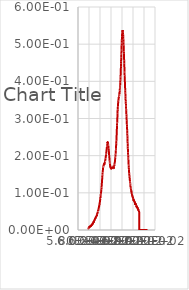
| Category | Series 0 |
|---|---|
| 598.5213013 | 0.005 |
| 598.6397705 | 0.004 |
| 598.7583008 | 0.005 |
| 598.87677 | 0.005 |
| 598.9953003 | 0.006 |
| 599.1138306 | 0.005 |
| 599.2322998 | 0.006 |
| 599.3508301 | 0.006 |
| 599.4693604 | 0.007 |
| 599.5878906 | 0.006 |
| 599.7064209 | 0.007 |
| 599.8248901 | 0.006 |
| 599.9434204 | 0.007 |
| 600.0619507 | 0.006 |
| 600.180481 | 0.007 |
| 600.2990112 | 0.007 |
| 600.4175415 | 0.007 |
| 600.5361328 | 0.007 |
| 600.6546631 | 0.008 |
| 600.7731934 | 0.007 |
| 600.8917236 | 0.008 |
| 601.0102539 | 0.008 |
| 601.1288452 | 0.009 |
| 601.2473755 | 0.007 |
| 601.3659058 | 0.009 |
| 601.4844971 | 0.009 |
| 601.6030273 | 0.01 |
| 601.7215576 | 0.008 |
| 601.8401489 | 0.01 |
| 601.9586792 | 0.009 |
| 602.0772705 | 0.01 |
| 602.1958008 | 0.009 |
| 602.3143921 | 0.01 |
| 602.4329834 | 0.01 |
| 602.5515137 | 0.008 |
| 602.670105 | 0.01 |
| 602.7886963 | 0.011 |
| 602.9072876 | 0.01 |
| 603.0258179 | 0.011 |
| 603.1444092 | 0.01 |
| 603.2630005 | 0.011 |
| 603.3815918 | 0.011 |
| 603.5001831 | 0.011 |
| 603.6187744 | 0.011 |
| 603.7373657 | 0.012 |
| 603.855957 | 0.012 |
| 603.9745483 | 0.012 |
| 604.0931396 | 0.012 |
| 604.211731 | 0.013 |
| 604.3303833 | 0.012 |
| 604.4489746 | 0.014 |
| 604.5675659 | 0.013 |
| 604.6861572 | 0.014 |
| 604.8048096 | 0.013 |
| 604.9234009 | 0.014 |
| 605.0419922 | 0.013 |
| 605.1606445 | 0.014 |
| 605.2792358 | 0.014 |
| 605.3978882 | 0.015 |
| 605.5164795 | 0.014 |
| 605.6351318 | 0.016 |
| 605.7537231 | 0.015 |
| 605.8723755 | 0.016 |
| 605.9910278 | 0.016 |
| 606.1096191 | 0.016 |
| 606.2282715 | 0.016 |
| 606.3469238 | 0.017 |
| 606.4655762 | 0.017 |
| 606.5841675 | 0.017 |
| 606.7028198 | 0.017 |
| 606.8214722 | 0.018 |
| 606.9401245 | 0.018 |
| 607.0587769 | 0.019 |
| 607.1774292 | 0.015 |
| 607.2960815 | 0.02 |
| 607.4147339 | 0.019 |
| 607.5333862 | 0.02 |
| 607.6520386 | 0.019 |
| 607.7706909 | 0.021 |
| 607.8893433 | 0.02 |
| 608.0080566 | 0.021 |
| 608.126709 | 0.021 |
| 608.2453613 | 0.022 |
| 608.3640137 | 0.022 |
| 608.4827271 | 0.022 |
| 608.6013794 | 0.022 |
| 608.7200317 | 0.022 |
| 608.8387451 | 0.021 |
| 608.9573975 | 0.022 |
| 609.0761108 | 0.021 |
| 609.1947632 | 0.023 |
| 609.3134766 | 0.025 |
| 609.4321289 | 0.025 |
| 609.5508423 | 0.026 |
| 609.6695557 | 0.026 |
| 609.788208 | 0.026 |
| 609.9069214 | 0.026 |
| 610.0256348 | 0.027 |
| 610.1443481 | 0.027 |
| 610.2630005 | 0.028 |
| 610.3817139 | 0.028 |
| 610.5004272 | 0.029 |
| 610.6191406 | 0.028 |
| 610.737854 | 0.029 |
| 610.8565674 | 0.029 |
| 610.9752808 | 0.03 |
| 611.0939941 | 0.03 |
| 611.2127075 | 0.031 |
| 611.3314209 | 0.03 |
| 611.4501343 | 0.032 |
| 611.5688477 | 0.032 |
| 611.687561 | 0.032 |
| 611.8063354 | 0.032 |
| 611.9250488 | 0.033 |
| 612.0437622 | 0.033 |
| 612.1624756 | 0.033 |
| 612.28125 | 0.033 |
| 612.3999634 | 0.035 |
| 612.5187378 | 0.035 |
| 612.6374512 | 0.035 |
| 612.7561646 | 0.035 |
| 612.874939 | 0.035 |
| 612.9936523 | 0.036 |
| 613.1124268 | 0.037 |
| 613.2312012 | 0.036 |
| 613.3499146 | 0.037 |
| 613.468689 | 0.037 |
| 613.5874023 | 0.038 |
| 613.7061768 | 0.038 |
| 613.8249512 | 0.038 |
| 613.9437256 | 0.039 |
| 614.062439 | 0.04 |
| 614.1812134 | 0.04 |
| 614.2999878 | 0.041 |
| 614.4187622 | 0.038 |
| 614.5375366 | 0.042 |
| 614.656311 | 0.042 |
| 614.7750854 | 0.043 |
| 614.8938599 | 0.042 |
| 615.0126343 | 0.044 |
| 615.1314087 | 0.044 |
| 615.2501831 | 0.045 |
| 615.3689575 | 0.045 |
| 615.4877319 | 0.047 |
| 615.6065063 | 0.046 |
| 615.7253418 | 0.047 |
| 615.8441162 | 0.047 |
| 615.9628906 | 0.049 |
| 616.081665 | 0.049 |
| 616.2005005 | 0.05 |
| 616.3192749 | 0.05 |
| 616.4380493 | 0.051 |
| 616.5568848 | 0.051 |
| 616.6756592 | 0.052 |
| 616.7944946 | 0.052 |
| 616.913269 | 0.055 |
| 617.0321045 | 0.054 |
| 617.1508789 | 0.056 |
| 617.2697144 | 0.056 |
| 617.3885498 | 0.057 |
| 617.5073242 | 0.058 |
| 617.6261597 | 0.059 |
| 617.7449951 | 0.059 |
| 617.8637695 | 0.061 |
| 617.982605 | 0.061 |
| 618.1014404 | 0.062 |
| 618.2202759 | 0.062 |
| 618.3391113 | 0.064 |
| 618.4579468 | 0.064 |
| 618.5767212 | 0.066 |
| 618.6955566 | 0.066 |
| 618.8143921 | 0.068 |
| 618.9332275 | 0.067 |
| 619.052063 | 0.069 |
| 619.1708984 | 0.07 |
| 619.2897339 | 0.071 |
| 619.4086304 | 0.072 |
| 619.5274658 | 0.073 |
| 619.6463013 | 0.074 |
| 619.7651367 | 0.075 |
| 619.8839722 | 0.076 |
| 620.0028687 | 0.079 |
| 620.1217041 | 0.079 |
| 620.2405396 | 0.081 |
| 620.359436 | 0.081 |
| 620.4782715 | 0.083 |
| 620.5971069 | 0.084 |
| 620.7160034 | 0.086 |
| 620.8348389 | 0.086 |
| 620.9537354 | 0.089 |
| 621.0725708 | 0.09 |
| 621.1914673 | 0.092 |
| 621.3103027 | 0.092 |
| 621.4291992 | 0.096 |
| 621.5480347 | 0.096 |
| 621.6669312 | 0.099 |
| 621.7858276 | 0.099 |
| 621.9047241 | 0.101 |
| 622.0235596 | 0.102 |
| 622.1424561 | 0.105 |
| 622.2613525 | 0.106 |
| 622.380249 | 0.108 |
| 622.4990845 | 0.11 |
| 622.617981 | 0.113 |
| 622.7368774 | 0.114 |
| 622.8557739 | 0.116 |
| 622.9746704 | 0.118 |
| 623.0935669 | 0.121 |
| 623.2124634 | 0.122 |
| 623.3313599 | 0.125 |
| 623.4502563 | 0.127 |
| 623.5691528 | 0.13 |
| 623.6880493 | 0.131 |
| 623.8070068 | 0.135 |
| 623.9259033 | 0.137 |
| 624.0447998 | 0.14 |
| 624.1636963 | 0.14 |
| 624.2825928 | 0.145 |
| 624.4015503 | 0.146 |
| 624.5204468 | 0.149 |
| 624.6393433 | 0.15 |
| 624.7583008 | 0.154 |
| 624.8771973 | 0.155 |
| 624.9960938 | 0.157 |
| 625.1150513 | 0.159 |
| 625.2339478 | 0.161 |
| 625.3529053 | 0.162 |
| 625.4718018 | 0.164 |
| 625.5907593 | 0.166 |
| 625.7097168 | 0.168 |
| 625.8286133 | 0.168 |
| 625.9475708 | 0.17 |
| 626.0664673 | 0.171 |
| 626.1854248 | 0.172 |
| 626.3043823 | 0.171 |
| 626.4233398 | 0.173 |
| 626.5422363 | 0.173 |
| 626.6611938 | 0.175 |
| 626.7801514 | 0.175 |
| 626.8991089 | 0.176 |
| 627.0180664 | 0.176 |
| 627.1370239 | 0.177 |
| 627.2559204 | 0.177 |
| 627.3748779 | 0.178 |
| 627.4938354 | 0.177 |
| 627.612793 | 0.179 |
| 627.7317505 | 0.175 |
| 627.850708 | 0.179 |
| 627.9697266 | 0.178 |
| 628.0886841 | 0.179 |
| 628.2076416 | 0.179 |
| 628.3265991 | 0.18 |
| 628.4455566 | 0.18 |
| 628.5645142 | 0.181 |
| 628.6835327 | 0.181 |
| 628.8024902 | 0.182 |
| 628.9214478 | 0.182 |
| 629.0404053 | 0.183 |
| 629.1594238 | 0.184 |
| 629.2783813 | 0.185 |
| 629.3973389 | 0.185 |
| 629.5163574 | 0.187 |
| 629.6353149 | 0.187 |
| 629.7543335 | 0.189 |
| 629.873291 | 0.19 |
| 629.9923096 | 0.192 |
| 630.1112671 | 0.192 |
| 630.2302856 | 0.194 |
| 630.3492432 | 0.196 |
| 630.4682617 | 0.197 |
| 630.5872803 | 0.198 |
| 630.7062378 | 0.2 |
| 630.8252563 | 0.199 |
| 630.9442749 | 0.203 |
| 631.0632324 | 0.203 |
| 631.182251 | 0.205 |
| 631.3012695 | 0.206 |
| 631.4202881 | 0.208 |
| 631.5393066 | 0.21 |
| 631.6583252 | 0.212 |
| 631.7772827 | 0.213 |
| 631.8963013 | 0.214 |
| 632.0153198 | 0.216 |
| 632.1343384 | 0.217 |
| 632.2533569 | 0.219 |
| 632.3723755 | 0.221 |
| 632.491394 | 0.222 |
| 632.6104126 | 0.225 |
| 632.7294312 | 0.225 |
| 632.8485107 | 0.227 |
| 632.9675293 | 0.229 |
| 633.0865479 | 0.232 |
| 633.2055664 | 0.234 |
| 633.324585 | 0.235 |
| 633.4436035 | 0.235 |
| 633.5626831 | 0.237 |
| 633.6817017 | 0.235 |
| 633.8007202 | 0.236 |
| 633.9197998 | 0.236 |
| 634.0388184 | 0.237 |
| 634.1578369 | 0.235 |
| 634.2769165 | 0.237 |
| 634.3959351 | 0.235 |
| 634.5150146 | 0.235 |
| 634.6340332 | 0.233 |
| 634.7531128 | 0.233 |
| 634.8721313 | 0.23 |
| 634.9912109 | 0.23 |
| 635.1102295 | 0.227 |
| 635.2293091 | 0.226 |
| 635.3483276 | 0.224 |
| 635.4674072 | 0.223 |
| 635.5864868 | 0.22 |
| 635.7055054 | 0.218 |
| 635.824585 | 0.215 |
| 635.9436646 | 0.214 |
| 636.0627441 | 0.212 |
| 636.1817627 | 0.21 |
| 636.3008423 | 0.208 |
| 636.4199219 | 0.205 |
| 636.5390015 | 0.202 |
| 636.6580811 | 0.201 |
| 636.7771606 | 0.199 |
| 636.8961792 | 0.196 |
| 637.0152588 | 0.195 |
| 637.1343384 | 0.193 |
| 637.253418 | 0.19 |
| 637.3724976 | 0.189 |
| 637.4915771 | 0.186 |
| 637.6106567 | 0.185 |
| 637.7297974 | 0.182 |
| 637.848877 | 0.181 |
| 637.9679565 | 0.179 |
| 638.0870361 | 0.178 |
| 638.2061157 | 0.176 |
| 638.3251953 | 0.175 |
| 638.4442749 | 0.173 |
| 638.5634155 | 0.172 |
| 638.6824951 | 0.171 |
| 638.8015747 | 0.172 |
| 638.9207153 | 0.17 |
| 639.0397949 | 0.169 |
| 639.1588745 | 0.167 |
| 639.2780151 | 0.168 |
| 639.3970947 | 0.166 |
| 639.5161743 | 0.166 |
| 639.6353149 | 0.167 |
| 639.7543945 | 0.167 |
| 639.8735352 | 0.168 |
| 639.9926147 | 0.167 |
| 640.1117554 | 0.168 |
| 640.230835 | 0.166 |
| 640.3499756 | 0.165 |
| 640.4691162 | 0.165 |
| 640.5881958 | 0.166 |
| 640.7073364 | 0.165 |
| 640.8264771 | 0.166 |
| 640.9455566 | 0.165 |
| 641.0646973 | 0.166 |
| 641.1838379 | 0.166 |
| 641.3029175 | 0.167 |
| 641.4220581 | 0.168 |
| 641.5411987 | 0.169 |
| 641.6603394 | 0.168 |
| 641.77948 | 0.169 |
| 641.8985596 | 0.168 |
| 642.0177002 | 0.169 |
| 642.1368408 | 0.169 |
| 642.2559814 | 0.169 |
| 642.3751221 | 0.17 |
| 642.4942627 | 0.17 |
| 642.6134033 | 0.17 |
| 642.7325439 | 0.17 |
| 642.8516846 | 0.169 |
| 642.9708252 | 0.17 |
| 643.0899658 | 0.17 |
| 643.2091064 | 0.17 |
| 643.3282471 | 0.169 |
| 643.4474487 | 0.17 |
| 643.5665894 | 0.169 |
| 643.68573 | 0.169 |
| 643.8048706 | 0.168 |
| 643.9240112 | 0.168 |
| 644.0432129 | 0.168 |
| 644.1623535 | 0.17 |
| 644.2814941 | 0.169 |
| 644.4006348 | 0.169 |
| 644.5198364 | 0.167 |
| 644.6389771 | 0.167 |
| 644.7581177 | 0.166 |
| 644.8773193 | 0.166 |
| 644.99646 | 0.165 |
| 645.1156616 | 0.167 |
| 645.2348022 | 0.167 |
| 645.3540039 | 0.17 |
| 645.4731445 | 0.171 |
| 645.5923462 | 0.173 |
| 645.7114868 | 0.172 |
| 645.8306885 | 0.174 |
| 645.9498291 | 0.173 |
| 646.0690308 | 0.175 |
| 646.1881714 | 0.175 |
| 646.307373 | 0.176 |
| 646.4265747 | 0.176 |
| 646.5457153 | 0.179 |
| 646.664917 | 0.179 |
| 646.7841187 | 0.181 |
| 646.9033203 | 0.182 |
| 647.0224609 | 0.183 |
| 647.1416626 | 0.185 |
| 647.2608643 | 0.188 |
| 647.3800659 | 0.189 |
| 647.4992065 | 0.191 |
| 647.6184082 | 0.192 |
| 647.7376099 | 0.194 |
| 647.8568115 | 0.195 |
| 647.9760132 | 0.199 |
| 648.0952148 | 0.199 |
| 648.2144165 | 0.202 |
| 648.3336182 | 0.203 |
| 648.4528198 | 0.206 |
| 648.5720215 | 0.209 |
| 648.6912231 | 0.212 |
| 648.8104248 | 0.214 |
| 648.9296265 | 0.217 |
| 649.0488281 | 0.219 |
| 649.1680298 | 0.223 |
| 649.2872314 | 0.226 |
| 649.4064331 | 0.23 |
| 649.5256958 | 0.232 |
| 649.6448975 | 0.237 |
| 649.7640991 | 0.24 |
| 649.8833008 | 0.243 |
| 650.0025024 | 0.247 |
| 650.1217651 | 0.252 |
| 650.2409668 | 0.255 |
| 650.3601685 | 0.261 |
| 650.4794312 | 0.264 |
| 650.5986328 | 0.269 |
| 650.7178345 | 0.273 |
| 650.8370972 | 0.278 |
| 650.9562988 | 0.281 |
| 651.0755615 | 0.286 |
| 651.1947632 | 0.289 |
| 651.3139648 | 0.294 |
| 651.4332275 | 0.298 |
| 651.5524292 | 0.302 |
| 651.6716919 | 0.305 |
| 651.7908936 | 0.31 |
| 651.9101563 | 0.313 |
| 652.0293579 | 0.321 |
| 652.1486206 | 0.321 |
| 652.2678833 | 0.324 |
| 652.387085 | 0.327 |
| 652.5063477 | 0.332 |
| 652.6256104 | 0.333 |
| 652.744812 | 0.337 |
| 652.8640747 | 0.339 |
| 652.9833374 | 0.341 |
| 653.1025391 | 0.344 |
| 653.2218018 | 0.347 |
| 653.3410645 | 0.346 |
| 653.4603271 | 0.349 |
| 653.5795288 | 0.351 |
| 653.6987915 | 0.352 |
| 653.8180542 | 0.353 |
| 653.9373169 | 0.354 |
| 654.0565796 | 0.355 |
| 654.1758423 | 0.357 |
| 654.295105 | 0.356 |
| 654.4143677 | 0.358 |
| 654.5335693 | 0.358 |
| 654.652832 | 0.36 |
| 654.7720947 | 0.36 |
| 654.8913574 | 0.362 |
| 655.0106201 | 0.364 |
| 655.1298828 | 0.365 |
| 655.2492065 | 0.365 |
| 655.3684692 | 0.369 |
| 655.4877319 | 0.368 |
| 655.6069946 | 0.371 |
| 655.7262573 | 0.371 |
| 655.84552 | 0.375 |
| 655.9647827 | 0.375 |
| 656.0840454 | 0.379 |
| 656.2033691 | 0.38 |
| 656.3226318 | 0.384 |
| 656.4418945 | 0.385 |
| 656.5611572 | 0.389 |
| 656.6804199 | 0.392 |
| 656.7997437 | 0.395 |
| 656.9190063 | 0.397 |
| 657.038269 | 0.402 |
| 657.1575928 | 0.404 |
| 657.2768555 | 0.41 |
| 657.3961182 | 0.413 |
| 657.5154419 | 0.418 |
| 657.6347046 | 0.422 |
| 657.7539673 | 0.427 |
| 657.873291 | 0.432 |
| 657.9925537 | 0.437 |
| 658.1118774 | 0.441 |
| 658.2311401 | 0.448 |
| 658.3504639 | 0.453 |
| 658.4697266 | 0.46 |
| 658.5890503 | 0.464 |
| 658.708313 | 0.472 |
| 658.8276367 | 0.475 |
| 658.9468994 | 0.482 |
| 659.0662231 | 0.486 |
| 659.1855469 | 0.492 |
| 659.3048096 | 0.496 |
| 659.4241333 | 0.502 |
| 659.543457 | 0.504 |
| 659.6627197 | 0.511 |
| 659.7820435 | 0.513 |
| 659.9013672 | 0.519 |
| 660.0206299 | 0.521 |
| 660.1399536 | 0.525 |
| 660.2592773 | 0.527 |
| 660.3786011 | 0.531 |
| 660.4978638 | 0.533 |
| 660.6171875 | 0.535 |
| 660.7365112 | 0.535 |
| 660.855835 | 0.537 |
| 660.9751587 | 0.536 |
| 661.0944214 | 0.538 |
| 661.2137451 | 0.536 |
| 661.3330688 | 0.537 |
| 661.4523926 | 0.535 |
| 661.5717163 | 0.535 |
| 661.69104 | 0.532 |
| 661.8103638 | 0.532 |
| 661.9296875 | 0.527 |
| 662.0490112 | 0.526 |
| 662.168335 | 0.521 |
| 662.2876587 | 0.519 |
| 662.4069824 | 0.514 |
| 662.5263062 | 0.513 |
| 662.6456299 | 0.508 |
| 662.7649536 | 0.505 |
| 662.8842773 | 0.5 |
| 663.0036011 | 0.496 |
| 663.1229248 | 0.49 |
| 663.2423096 | 0.487 |
| 663.3616333 | 0.48 |
| 663.480957 | 0.476 |
| 663.6002808 | 0.471 |
| 663.7196045 | 0.466 |
| 663.8389282 | 0.46 |
| 663.958313 | 0.456 |
| 664.0776367 | 0.448 |
| 664.1969604 | 0.444 |
| 664.3162842 | 0.439 |
| 664.4356689 | 0.434 |
| 664.5549927 | 0.427 |
| 664.6743164 | 0.423 |
| 664.7937012 | 0.416 |
| 664.9130249 | 0.412 |
| 665.0323486 | 0.408 |
| 665.1517334 | 0.403 |
| 665.2710571 | 0.397 |
| 665.3903809 | 0.392 |
| 665.5097656 | 0.388 |
| 665.6290894 | 0.384 |
| 665.7484741 | 0.379 |
| 665.8677979 | 0.376 |
| 665.9871826 | 0.371 |
| 666.1065063 | 0.368 |
| 666.2258911 | 0.363 |
| 666.3452148 | 0.36 |
| 666.4645996 | 0.353 |
| 666.5839233 | 0.35 |
| 666.7033081 | 0.346 |
| 666.8226318 | 0.346 |
| 666.9420166 | 0.341 |
| 667.0614014 | 0.339 |
| 667.1807251 | 0.335 |
| 667.3001099 | 0.332 |
| 667.4194336 | 0.326 |
| 667.5388184 | 0.325 |
| 667.6582031 | 0.321 |
| 667.7775269 | 0.318 |
| 667.8969116 | 0.314 |
| 668.0162964 | 0.311 |
| 668.1356812 | 0.305 |
| 668.2550049 | 0.304 |
| 668.3743896 | 0.299 |
| 668.4937744 | 0.296 |
| 668.6131592 | 0.292 |
| 668.7324829 | 0.289 |
| 668.8518677 | 0.284 |
| 668.9712524 | 0.283 |
| 669.0906372 | 0.278 |
| 669.210022 | 0.275 |
| 669.3293457 | 0.271 |
| 669.4487305 | 0.267 |
| 669.5681152 | 0.261 |
| 669.6875 | 0.259 |
| 669.8068848 | 0.253 |
| 669.9262695 | 0.251 |
| 670.0456543 | 0.245 |
| 670.1650391 | 0.238 |
| 670.2844238 | 0.232 |
| 670.4038086 | 0.228 |
| 670.5231934 | 0.225 |
| 670.6425781 | 0.219 |
| 670.7619629 | 0.215 |
| 670.8813477 | 0.211 |
| 671.0007324 | 0.208 |
| 671.1201172 | 0.203 |
| 671.239502 | 0.2 |
| 671.3588867 | 0.195 |
| 671.4782715 | 0.193 |
| 671.5976563 | 0.189 |
| 671.717041 | 0.187 |
| 671.8364258 | 0.183 |
| 671.9558105 | 0.18 |
| 672.0752563 | 0.175 |
| 672.1946411 | 0.174 |
| 672.3140259 | 0.169 |
| 672.4334106 | 0.168 |
| 672.5527954 | 0.163 |
| 672.6721802 | 0.161 |
| 672.791626 | 0.158 |
| 672.9110107 | 0.156 |
| 673.0303955 | 0.153 |
| 673.1497803 | 0.152 |
| 673.2692261 | 0.146 |
| 673.3886108 | 0.147 |
| 673.5079956 | 0.145 |
| 673.6274414 | 0.143 |
| 673.7468262 | 0.141 |
| 673.8662109 | 0.14 |
| 673.9856567 | 0.137 |
| 674.1050415 | 0.136 |
| 674.2244263 | 0.134 |
| 674.3438721 | 0.133 |
| 674.4632568 | 0.131 |
| 674.5826416 | 0.131 |
| 674.7020874 | 0.127 |
| 674.8214722 | 0.127 |
| 674.940918 | 0.125 |
| 675.0603027 | 0.125 |
| 675.1796875 | 0.122 |
| 675.2991333 | 0.121 |
| 675.4185181 | 0.119 |
| 675.5379639 | 0.119 |
| 675.6573486 | 0.116 |
| 675.7767944 | 0.116 |
| 675.8961792 | 0.113 |
| 676.015625 | 0.113 |
| 676.1350098 | 0.111 |
| 676.2544556 | 0.111 |
| 676.3739014 | 0.108 |
| 676.4932861 | 0.109 |
| 676.6127319 | 0.106 |
| 676.7321167 | 0.107 |
| 676.8515625 | 0.105 |
| 676.9710083 | 0.106 |
| 677.0903931 | 0.102 |
| 677.2098389 | 0.103 |
| 677.3292236 | 0.1 |
| 677.4486694 | 0.101 |
| 677.5681152 | 0.1 |
| 677.6875 | 0.1 |
| 677.8069458 | 0.098 |
| 677.9263916 | 0.098 |
| 678.0458374 | 0.096 |
| 678.1652222 | 0.096 |
| 678.284668 | 0.094 |
| 678.4041138 | 0.095 |
| 678.5235596 | 0.093 |
| 678.6429443 | 0.094 |
| 678.7623901 | 0.092 |
| 678.8818359 | 0.092 |
| 679.0012817 | 0.091 |
| 679.1206665 | 0.091 |
| 679.2401123 | 0.089 |
| 679.3595581 | 0.089 |
| 679.4790039 | 0.089 |
| 679.5984497 | 0.088 |
| 679.7178955 | 0.087 |
| 679.8372803 | 0.088 |
| 679.9567261 | 0.085 |
| 680.0761719 | 0.086 |
| 680.1956177 | 0.085 |
| 680.3150635 | 0.085 |
| 680.4345093 | 0.084 |
| 680.5539551 | 0.085 |
| 680.6734009 | 0.083 |
| 680.7928467 | 0.083 |
| 680.9122925 | 0.081 |
| 681.0317383 | 0.082 |
| 681.1511841 | 0.079 |
| 681.2706299 | 0.082 |
| 681.3900757 | 0.079 |
| 681.5095215 | 0.081 |
| 681.6289673 | 0.079 |
| 681.7484131 | 0.08 |
| 681.8678589 | 0.078 |
| 681.9873047 | 0.079 |
| 682.1067505 | 0.077 |
| 682.2261963 | 0.078 |
| 682.3456421 | 0.077 |
| 682.4650879 | 0.078 |
| 682.5845337 | 0.076 |
| 682.7039795 | 0.077 |
| 682.8234253 | 0.076 |
| 682.9428711 | 0.076 |
| 683.0623169 | 0.075 |
| 683.1817627 | 0.075 |
| 683.3012695 | 0.073 |
| 683.4207153 | 0.075 |
| 683.5401611 | 0.072 |
| 683.6596069 | 0.073 |
| 683.7790527 | 0.071 |
| 683.8984985 | 0.072 |
| 684.0180054 | 0.071 |
| 684.1374512 | 0.072 |
| 684.256897 | 0.067 |
| 684.3763428 | 0.071 |
| 684.4957886 | 0.069 |
| 684.6152954 | 0.07 |
| 684.7347412 | 0.068 |
| 684.854187 | 0.069 |
| 684.9736328 | 0.068 |
| 685.0931396 | 0.069 |
| 685.2125854 | 0.068 |
| 685.3320313 | 0.068 |
| 685.4514771 | 0.067 |
| 685.5709839 | 0.067 |
| 685.6904297 | 0.066 |
| 685.8098755 | 0.067 |
| 685.9293823 | 0.066 |
| 686.0488281 | 0.066 |
| 686.1682739 | 0.064 |
| 686.2877808 | 0.066 |
| 686.4072266 | 0.063 |
| 686.5266724 | 0.065 |
| 686.6461792 | 0.062 |
| 686.765625 | 0.064 |
| 686.8851318 | 0.06 |
| 687.0045776 | 0.063 |
| 687.1240234 | 0.061 |
| 687.2435303 | 0.063 |
| 687.3629761 | 0.061 |
| 687.4824829 | 0.062 |
| 687.6019287 | 0.06 |
| 687.7213745 | 0.061 |
| 687.8408813 | 0.059 |
| 687.9603271 | 0.06 |
| 688.079834 | 0.059 |
| 688.1992798 | 0.059 |
| 688.3187866 | 0.058 |
| 688.4382324 | 0.058 |
| 688.5577393 | 0.057 |
| 688.6771851 | 0.058 |
| 688.7966919 | 0.057 |
| 688.9161377 | 0.057 |
| 689.0356445 | 0.056 |
| 689.1550903 | 0.057 |
| 689.2745972 | 0.055 |
| 689.394043 | 0.055 |
| 689.5135498 | 0.054 |
| 689.6329956 | 0.055 |
| 689.7525024 | 0.053 |
| 689.8719482 | 0.054 |
| 689.9914551 | 0.053 |
| 690.1109619 | 0.053 |
| 690.2304077 | 0.052 |
| 690.3499146 | 0.052 |
| 690.4693604 | 0.052 |
| 690.5888672 | 0.052 |
| 690.708374 | 0.051 |
| 690.8278198 | 0.051 |
| 690.9473267 | 0.049 |
| 691.0667725 | 0.051 |
| 691.1862793 | 0.049 |
| 691.3057861 | 0 |
| 691.4252319 | 0 |
| 691.5447388 | 0 |
| 691.6642456 | 0 |
| 691.7836914 | 0 |
| 691.9031982 | 0 |
| 692.0227051 | 0 |
| 692.1421509 | 0 |
| 692.2616577 | 0 |
| 692.3811646 | 0 |
| 692.5006104 | 0 |
| 692.6201172 | 0 |
| 692.739624 | 0 |
| 692.8591309 | 0 |
| 692.9785767 | 0 |
| 693.0980835 | 0 |
| 693.2175903 | 0 |
| 693.3370361 | 0 |
| 693.456543 | 0 |
| 693.5760498 | 0 |
| 693.6955566 | 0 |
| 693.8150024 | 0 |
| 693.9345093 | 0 |
| 694.0540161 | 0 |
| 694.1735229 | 0 |
| 694.2930298 | 0 |
| 694.4124756 | 0 |
| 694.5319824 | 0 |
| 694.6514893 | 0 |
| 694.7709961 | 0 |
| 694.8905029 | 0 |
| 695.0099487 | 0 |
| 695.1294556 | 0 |
| 695.2489624 | 0 |
| 695.3684692 | 0 |
| 695.4879761 | 0 |
| 695.6074829 | 0 |
| 695.7269287 | 0 |
| 695.8464355 | 0 |
| 695.9659424 | 0 |
| 696.0854492 | 0 |
| 696.2049561 | 0 |
| 696.3244629 | 0 |
| 696.4439697 | 0 |
| 696.5634155 | 0 |
| 696.6829224 | 0 |
| 696.8024292 | 0 |
| 696.921936 | 0 |
| 697.0414429 | 0 |
| 697.1609497 | 0 |
| 697.2804565 | 0 |
| 697.3999634 | 0 |
| 697.5194702 | 0 |
| 697.6389771 | 0 |
| 697.7584839 | 0 |
| 697.8779297 | 0 |
| 697.9974365 | 0 |
| 698.1169434 | 0 |
| 698.2364502 | 0 |
| 698.355957 | 0 |
| 698.4754639 | 0 |
| 698.5949707 | 0 |
| 698.7144775 | 0 |
| 698.8339844 | 0 |
| 698.9534912 | 0 |
| 699.072998 | 0 |
| 699.1925049 | 0 |
| 699.3120117 | 0 |
| 699.4315186 | 0 |
| 699.5510254 | 0 |
| 699.6705322 | 0 |
| 699.7900391 | 0 |
| 699.9095459 | 0 |
| 700.0290527 | 0 |
| 700.1485596 | 0 |
| 700.2680664 | 0 |
| 700.3875732 | 0 |
| 700.5070801 | 0 |
| 700.6265869 | 0 |
| 700.7460938 | 0 |
| 700.8656006 | 0 |
| 700.9851074 | 0 |
| 701.1046143 | 0 |
| 701.2241211 | 0 |
| 701.3436279 | 0 |
| 701.4631348 | 0 |
| 701.5826416 | 0 |
| 701.7021484 | 0 |
| 701.8216553 | 0 |
| 701.9411621 | 0 |
| 702.0606689 | 0 |
| 702.1801758 | 0 |
| 702.2997437 | 0 |
| 702.4192505 | 0 |
| 702.5387573 | 0 |
| 702.6582642 | 0 |
| 702.777771 | 0 |
| 702.8972778 | 0 |
| 703.0167847 | 0 |
| 703.1362915 | 0 |
| 703.2557983 | 0 |
| 703.3753052 | 0 |
| 703.494812 | 0 |
| 703.6143188 | 0 |
| 703.7338867 | 0 |
| 703.8533936 | 0 |
| 703.9729004 | 0 |
| 704.0924072 | 0 |
| 704.2119141 | 0 |
| 704.3314209 | 0 |
| 704.4509277 | 0 |
| 704.5704346 | 0 |
| 704.6899414 | 0 |
| 704.8094482 | 0 |
| 704.9290161 | 0 |
| 705.0485229 | 0 |
| 705.1680298 | 0 |
| 705.2875366 | 0 |
| 705.4070435 | 0 |
| 705.5265503 | 0 |
| 705.6460571 | 0 |
| 705.765564 | 0 |
| 705.8851318 | 0 |
| 706.0046387 | 0 |
| 706.1241455 | 0 |
| 706.2436523 | 0 |
| 706.3631592 | 0 |
| 706.482666 | 0 |